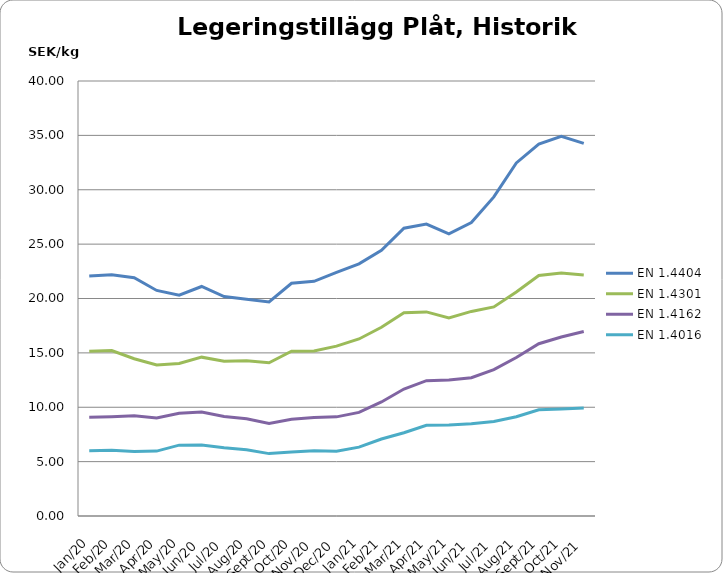
| Category | EN 1.4404 | EN 1.4301 | EN 1.4162  | EN 1.4016 |
|---|---|---|---|---|
| 2020-01-01 | 22.07 | 15.14 | 9.09 | 6 |
| 2020-02-01 | 22.19 | 15.21 | 9.13 | 6.05 |
| 2020-03-01 | 21.911 | 14.462 | 9.207 | 5.938 |
| 2020-04-01 | 20.74 | 13.88 | 9.02 | 5.97 |
| 2020-05-01 | 20.311 | 14.022 | 9.455 | 6.515 |
| 2020-06-01 | 21.105 | 14.607 | 9.554 | 6.524 |
| 2020-07-01 | 20.18 | 14.24 | 9.15 | 6.27 |
| 2020-08-01 | 19.932 | 14.286 | 8.939 | 6.099 |
| 2020-09-01 | 19.682 | 14.092 | 8.509 | 5.737 |
| 2020-10-01 | 21.4 | 15.147 | 8.892 | 5.888 |
| 2020-11-01 | 21.582 | 15.177 | 9.062 | 6.011 |
| 2020-12-01 | 22.402 | 15.617 | 9.115 | 5.945 |
| 2021-01-01 | 23.183 | 16.279 | 9.524 | 6.334 |
| 2021-02-01 | 24.425 | 17.354 | 10.488 | 7.077 |
| 2021-03-01 | 26.469 | 18.69 | 11.679 | 7.656 |
| 2021-04-01 | 26.842 | 18.766 | 12.443 | 8.336 |
| 2021-05-01 | 25.936 | 18.21 | 12.499 | 8.373 |
| 2021-06-01 | 26.983 | 18.811 | 12.71 | 8.473 |
| 2021-07-01 | 29.342 | 19.226 | 13.458 | 8.692 |
| 2021-08-01 | 32.47 | 20.6 | 14.57 | 9.13 |
| 2021-09-01 | 34.198 | 22.11 | 15.843 | 9.772 |
| 2021-10-01 | 34.921 | 22.349 | 16.463 | 9.835 |
| 2021-11-01 | 34.269 | 22.154 | 16.96 | 9.932 |